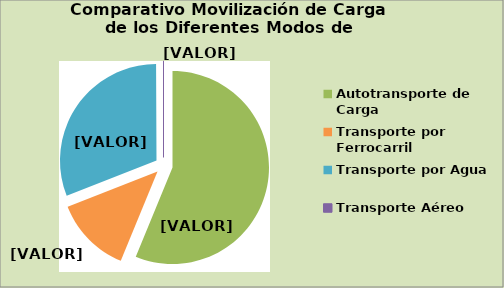
| Category | Series 0 |
|---|---|
| Autotransporte de Carga | 56.213 |
| Transporte por Ferrocarril | 12.827 |
| Transporte por Agua | 30.89 |
| Transporte Aéreo | 0.07 |